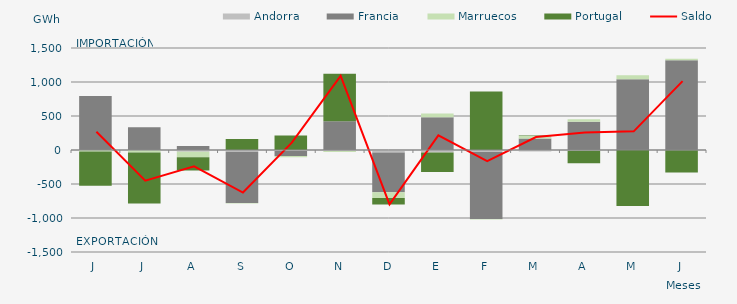
| Category | Andorra | Francia | Marruecos | Portugal |
|---|---|---|---|---|
| J | -0.008 | 792.83 | -21.038 | -502.886 |
| J | -5.052 | 334.729 | -33.385 | -747.138 |
| A | -26.107 | 60.563 | -80.137 | -193.987 |
| S | -25.668 | -754.78 | -5.797 | 160.618 |
| O | -15.157 | -73.766 | -16.017 | 213.105 |
| N | -14.884 | 423.038 | -15.41 | 698.188 |
| D | -35.076 | -586.843 | -82.554 | -95.842 |
| E | -38.419 | 481.868 | 55.475 | -284.018 |
| F | -28.394 | -984.629 | -8.698 | 859.135 |
| M | -22.893 | 167.561 | 36.658 | 8.529 |
| A | -12.109 | 414.006 | 37.615 | -182.927 |
| M | 0 | 1041.33 | 58.27 | -825.3 |
| J | -5.126 | 1319.492 | 23.039 | -324.448 |